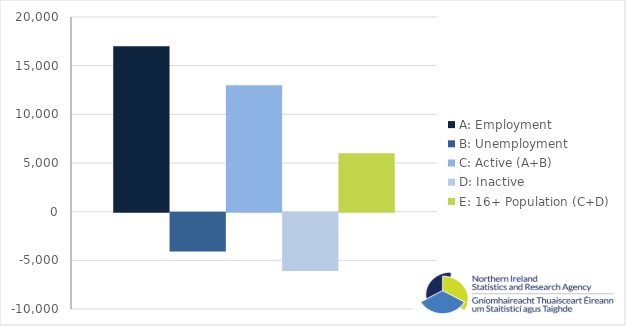
| Category | A: Employment | B: Unemployment | C: Active (A+B) | D: Inactive | E: 16+ Population (C+D) |
|---|---|---|---|---|---|
| 0 | 17000 | -4000 | 13000 | -6000 | 6000 |